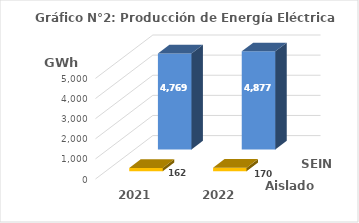
| Category | Aislados | SEIN |
|---|---|---|
| 2021.0 | 161.929 | 4768.585 |
| 2022.0 | 169.943 | 4877.161 |